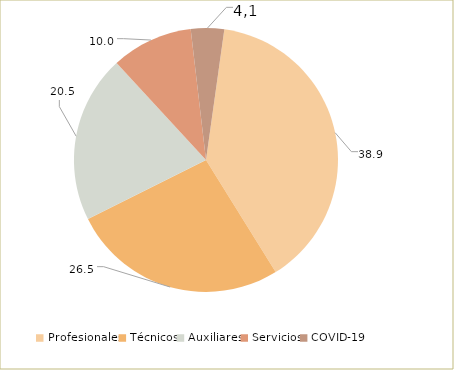
| Category | Series 0 |
|---|---|
| Profesionales | 38.928 |
| Técnicos | 26.464 |
| Auxiliares | 20.541 |
| Servicios | 9.99 |
| COVID-19 | 4.077 |